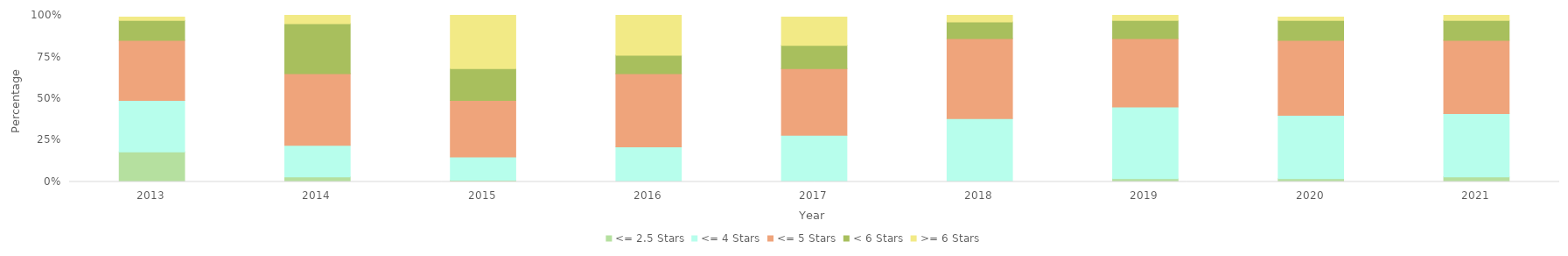
| Category | <= 2.5 Stars | <= 4 Stars | <= 5 Stars | < 6 Stars | >= 6 Stars |
|---|---|---|---|---|---|
| 2013.0 | 0.18 | 0.31 | 0.36 | 0.12 | 0.02 |
| 2014.0 | 0.03 | 0.19 | 0.43 | 0.3 | 0.05 |
| 2015.0 | 0.01 | 0.14 | 0.34 | 0.19 | 0.32 |
| 2016.0 | 0 | 0.21 | 0.44 | 0.11 | 0.24 |
| 2017.0 | 0 | 0.28 | 0.4 | 0.14 | 0.17 |
| 2018.0 | 0 | 0.38 | 0.48 | 0.1 | 0.04 |
| 2019.0 | 0.02 | 0.43 | 0.41 | 0.11 | 0.04 |
| 2020.0 | 0.02 | 0.38 | 0.45 | 0.12 | 0.02 |
| 2021.0 | 0.03 | 0.38 | 0.44 | 0.12 | 0.04 |